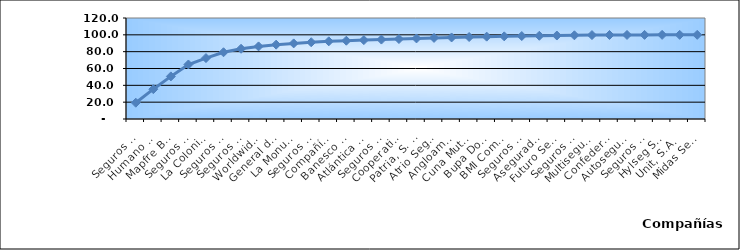
| Category | Series 0 |
|---|---|
| Seguros Universal, S. A. | 19.342 |
| Humano Seguros, S. A. | 35.445 |
| Mapfre BHD Compañía de Seguros | 50.607 |
| Seguros Reservas, S. A. | 64.759 |
| La Colonial, S. A., Compañia De Seguros | 72.39 |
| Seguros Sura, S.A. | 79.306 |
| Seguros Crecer, S. A. | 83.447 |
| Worldwide Seguros, S. A. | 86.262 |
| General de Seguros, S. A. | 88.345 |
| La Monumental de Seguros, S. A. | 89.83 |
| Seguros Pepín, S. A. | 91.198 |
| Compañía Dominicana de Seguros, C. por A. | 92.296 |
| Banesco Seguros | 93.018 |
| Atlántica Seguros, S. A. | 93.715 |
| Seguros La Internacional, S. A. | 94.381 |
| Cooperativa Nacional De Seguros, Inc  | 95.015 |
| Patria, S. A., Compañía de Seguros | 95.731 |
| Atrio Seguros S. A. | 96.336 |
| Angloamericana de Seguros, S. A. | 96.885 |
| Cuna Mutual Insurance Society Dominicana | 97.425 |
| Bupa Dominicana, S. A. | 97.843 |
| BMI Compañía de Seguros, S. A. | 98.218 |
| Seguros APS, S.R.L. | 98.559 |
| Aseguradora Agropecuaria Dominicana, S. A. | 98.875 |
| Futuro Seguros | 99.174 |
| Seguros Ademi, S.A. | 99.445 |
| Multiseguros Su, S.A. | 99.713 |
| Confederación del Canadá Dominicana, S. A. | 99.819 |
| Autoseguro, S. A. | 99.871 |
| Seguros Yunen, S.A. | 99.92 |
| Hylseg Seguros S.A | 99.966 |
| Unit, S.A. | 99.99 |
| Midas Seguros, S.A. | 100 |